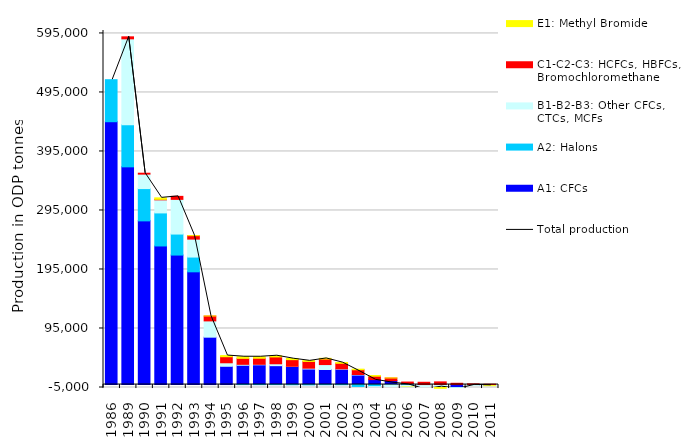
| Category | A1: CFCs | A2: Halons | B1-B2-B3: Other CFCs, CTCs, MCFs | C1-C2-C3: HCFCs, HBFCs, Bromochloromethane | E1: Methyl Bromide |
|---|---|---|---|---|---|
| 1986.0 | 445423.4 | 71193 | 0 | 0 | 0 |
| 1989.0 | 368940.4 | 71537 | 145402 | 3384 | 0 |
| 1990.0 | 277377.6 | 54722 | 24485 | 1559.5 | 0 |
| 1991.0 | 234865.2 | 56004 | 22128.7 | 880.9 | 2517 |
| 1992.0 | 219430.8 | 35618 | 58789.9 | 5084 | 0 |
| 1993.0 | 191043.6 | 25022 | 30394 | 5876.3 | 2.6 |
| 1994.0 | 80287.3 | 0 | 27579.6 | 8315.8 | 12.6 |
| 1995.0 | 30949 | 0 | 5951.3 | 10242 | 1997.8 |
| 1996.0 | 32690 | -3 | 1568.4 | 10145.9 | 2751 |
| 1997.0 | 33435.4 | -60 | 855.3 | 10292.7 | 2587.5 |
| 1998.0 | 31993.5 | -37.4 | 3226.2 | 11572.3 | 2111.4 |
| 1999.0 | 30568.8 | -290 | 355.9 | 11262.9 | 1916.4 |
| 2000.0 | 26348.6 | -500.1 | 1368.2 | 11513.5 | 1424.4 |
| 2001.0 | 25512.1 | -220.1 | 8349.6 | 9334.5 | 1276.3 |
| 2002.0 | 25979.8 | -223.1 | 649.7 | 9403.7 | 1266.3 |
| 2003.0 | 16180.9 | -3218.2 | 832.1 | 8035.8 | 1027.2 |
| 2004.0 | 8397.2 | -3480.5 | -3795 | 5756 | 1119.2 |
| 2005.0 | 6622.3 | -550.6 | -7343.7 | 4497.2 | 93 |
| 2006.0 | 1681.6 | -1318.3 | -2823.3 | 2549 | -3.6 |
| 2007.0 | -455.2 | -1088 | -10325.7 | 3863.5 | 0 |
| 2008.0 | 60.8 | -595 | -7443.1 | 4451.2 | -0.1 |
| 2009.0 | -5672.6 | -392.5 | -3283.9 | 2155.4 | 0 |
| 2010.0 | -727.9 | -87.1 | -912.1 | 1182.9 | 0 |
| 2011.0 | -1292 | -252.9 | -341.1 | 578.47 | -0.1 |